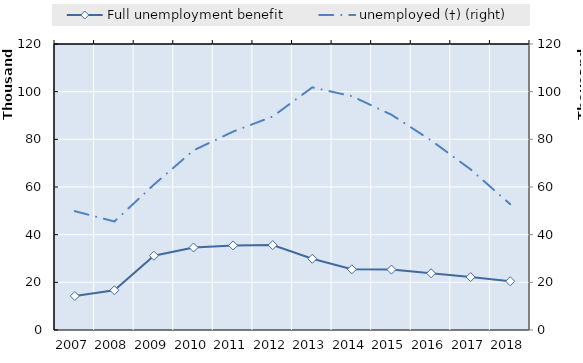
| Category | Series 4 | Series 5 | Series 6 | Series 7 | Series 8 | Series 9 | Series 10 | Series 11 | Series 12 | Series 13 | Series 14 | Series 15 | Series 16 | Series 17 | Series 18 | Series 19 | Full unemployment benefit | Series 1 |
|---|---|---|---|---|---|---|---|---|---|---|---|---|---|---|---|---|---|---|
| 2007.0 |  |  |  |  |  |  |  |  |  |  |  |  |  |  |  |  | 14270 |  |
| 2008.0 |  |  |  |  |  |  |  |  |  |  |  |  |  |  |  |  | 16666 |  |
| 2009.0 |  |  |  |  |  |  |  |  |  |  |  |  |  |  |  |  | 31162 |  |
| 2010.0 |  |  |  |  |  |  |  |  |  |  |  |  |  |  |  |  | 34623 |  |
| 2011.0 |  |  |  |  |  |  |  |  |  |  |  |  |  |  |  |  | 35463 |  |
| 2012.0 |  |  |  |  |  |  |  |  |  |  |  |  |  |  |  |  | 35614 |  |
| 2013.0 |  |  |  |  |  |  |  |  |  |  |  |  |  |  |  |  | 29895 |  |
| 2014.0 |  |  |  |  |  |  |  |  |  |  |  |  |  |  |  |  | 25452 |  |
| 2015.0 |  |  |  |  |  |  |  |  |  |  |  |  |  |  |  |  | 25342 |  |
| 2016.0 |  |  |  |  |  |  |  |  |  |  |  |  |  |  |  |  | 23820 |  |
| 2017.0 |  |  |  |  |  |  |  |  |  |  |  |  |  |  |  |  | 22207 |  |
| 2018.0 |  |  |  |  |  |  |  |  |  |  |  |  |  |  |  |  | 20457 |  |